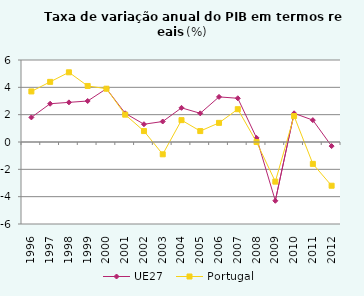
| Category | UE27 | Portugal |
|---|---|---|
| 1996.0 | 1.8 | 3.7 |
| 1997.0 | 2.8 | 4.4 |
| 1998.0 | 2.9 | 5.1 |
| 1999.0 | 3 | 4.1 |
| 2000.0 | 3.9 | 3.9 |
| 2001.0 | 2.1 | 2 |
| 2002.0 | 1.3 | 0.8 |
| 2003.0 | 1.5 | -0.9 |
| 2004.0 | 2.5 | 1.6 |
| 2005.0 | 2.1 | 0.8 |
| 2006.0 | 3.3 | 1.4 |
| 2007.0 | 3.2 | 2.4 |
| 2008.0 | 0.3 | 0 |
| 2009.0 | -4.3 | -2.9 |
| 2010.0 | 2.1 | 1.9 |
| 2011.0 | 1.6 | -1.6 |
| 2012.0 | -0.3 | -3.2 |